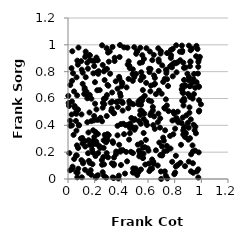
| Category | Series 0 |
|---|---|
| 0.797304120029426 | 0.036 |
| 0.562357184556947 | 0.157 |
| 0.10680305037132208 | 0.306 |
| 0.9210749633324836 | 0.444 |
| 0.9110553314862836 | 0.534 |
| 0.48899094206666055 | 0.079 |
| 0.292231240850581 | 0.625 |
| 0.6947383864375963 | 0.935 |
| 0.542647150077309 | 0.51 |
| 0.5552120279888694 | 0.765 |
| 0.5012308801654148 | 0.446 |
| 0.20232297530727178 | 0.722 |
| 0.7796913870292098 | 0.832 |
| 0.04175667667707427 | 0.329 |
| 0.6522087068755884 | 0.709 |
| 0.18581594822627015 | 0.283 |
| 0.04990359536149041 | 0.544 |
| 0.12496527432047042 | 0.665 |
| 0.8523837978286677 | 0.417 |
| 0.2723379696044072 | 0.557 |
| 0.08138933473945228 | 0.403 |
| 0.915738198230289 | 0.611 |
| 0.18407870867180115 | 0.882 |
| 0.06975780807988681 | 0.013 |
| 0.822844768852436 | 0.104 |
| 0.03783914964844198 | 0.789 |
| 0.2724436079722202 | 0.595 |
| 0.3286869476544123 | 0.117 |
| 0.5074196808023748 | 0.078 |
| 0.3452066169501058 | 0.491 |
| 0.8660786445725674 | 0.548 |
| 0.5507988313020094 | 0.191 |
| 0.2132866893592534 | 0.905 |
| 0.9770257955597358 | 0.072 |
| 0.3736721654983843 | 0.536 |
| 0.15332209954769954 | 0.347 |
| 0.959522285524678 | 0.341 |
| 0.9105750412460314 | 0.494 |
| 0.16311441660137105 | 0.626 |
| 0.6304751476399899 | 0.077 |
| 0.9225078808155771 | 0.057 |
| 0.016827779820845115 | 0.701 |
| 0.872804809920085 | 0.583 |
| 0.03272421377389287 | 0.075 |
| 0.40459552847335645 | 0.72 |
| 0.19645350370171416 | 0.842 |
| 0.93934130254535 | 0.046 |
| 0.631138142138714 | 0.146 |
| 0.44771538818155115 | 0.853 |
| 0.659343890614306 | 0.633 |
| 0.7223621296714514 | 0.206 |
| 0.20224215706489848 | 0.882 |
| 0.12741494213886012 | 0.069 |
| 0.1443889356698664 | 0.867 |
| 0.008023728772806542 | 0.544 |
| 0.22666194082235155 | 0.784 |
| 0.3281425669211869 | 0.524 |
| 0.6809794687354392 | 0.874 |
| 0.9660561663545146 | 0.057 |
| 0.3310503501570942 | 0.645 |
| 0.6848724084109689 | 0.272 |
| 0.8808588103777517 | 0.345 |
| 0.16113645419936 | 0.923 |
| 0.5972478004163653 | 0.229 |
| 0.43587601877007776 | 0.202 |
| 0.6393982162621628 | 0.129 |
| 0.8648941437922311 | 0.867 |
| 0.8032684712133998 | 0.375 |
| 0.9233217938147844 | 0.184 |
| 0.4719972542140556 | 0.203 |
| 0.6365499886286003 | 0.511 |
| 0.30268762180838643 | 0.695 |
| 0.702957025386663 | 0.181 |
| 0.7414386745604448 | 0.247 |
| 0.45045944991184106 | 0.404 |
| 0.15473699106804067 | 0.046 |
| 0.5545125304437247 | 0.507 |
| 0.49676690364538656 | 0.983 |
| 0.02602936098509044 | 0.826 |
| 0.045810744651686996 | 0.653 |
| 0.07406146694787234 | 0.516 |
| 0.918443603866554 | 0.873 |
| 0.10341630874351047 | 0.815 |
| 0.14461916418766874 | 0.601 |
| 0.3427914341111585 | 0.491 |
| 0.22628623821176183 | 0.193 |
| 0.8689484610541626 | 0.38 |
| 0.129187609163948 | 0.91 |
| 0.21180949395285975 | 0.279 |
| 0.8815725052715918 | 0.831 |
| 0.18838875355677628 | 0.197 |
| 0.6190518482586228 | 0.82 |
| 0.74276472355665 | 0.938 |
| 0.9803147501037893 | 0.198 |
| 0.30046426453416303 | 0.942 |
| 0.8394143871771651 | 0.949 |
| 0.519066964696049 | 0.029 |
| 0.5570427996413652 | 0.923 |
| 0.45458405404573626 | 0.746 |
| 0.540816347905991 | 0.478 |
| 0.25542111734223555 | 0.431 |
| 0.532416581095142 | 0.432 |
| 0.1829809473197042 | 0.255 |
| 0.5925604558414671 | 0.402 |
| 0.6224351350225935 | 0.697 |
| 0.3002076240817863 | 0.161 |
| 0.9531077058207814 | 0.212 |
| 0.3714735967905806 | 0.396 |
| 0.2906268035671282 | 0.469 |
| 0.06999816291292076 | 0.882 |
| 0.48494133896559266 | 0.782 |
| 0.4953388224582171 | 0.44 |
| 0.9338875728073217 | 0.25 |
| 0.823182205011867 | 0.502 |
| 0.7858391594595168 | 0.765 |
| 0.3932845069431305 | 0.204 |
| 0.1885405665417277 | 0.363 |
| 0.7354584692676264 | 0.815 |
| 0.060648302424327206 | 0.176 |
| 0.05935084553625411 | 0.433 |
| 0.20801742205660126 | 0.01 |
| 0.9641509602545535 | 0.722 |
| 0.16401753478787567 | 0.922 |
| 0.38127063412288903 | 0.579 |
| 0.8779642598553911 | 0.313 |
| 0.6592409482618403 | 0.214 |
| 0.6510733542427533 | 0.374 |
| 0.9772159047963628 | 0.011 |
| 0.22308847171384444 | 0.885 |
| 0.3352350416149271 | 0.281 |
| 0.33404323952458853 | 0.984 |
| 0.6109073474286287 | 0.797 |
| 0.17469925392602603 | 0.432 |
| 0.9362532482798492 | 0.205 |
| 0.14979038493730507 | 0.823 |
| 0.8704195854369463 | 0.738 |
| 0.3714854138865541 | 0.673 |
| 0.5320488843358153 | 0.211 |
| 0.5285368006332622 | 0.578 |
| 0.5429685772948672 | 0.592 |
| 0.4461229282433632 | 0.979 |
| 0.6057184862246477 | 0.586 |
| 0.49893564743686153 | 0.367 |
| 0.5756301413712744 | 0.237 |
| 0.3194495722353461 | 0.569 |
| 0.42740918105962417 | 0.04 |
| 0.6768639330235154 | 0.974 |
| 0.24380000151550588 | 0.456 |
| 0.12914594599068477 | 0.242 |
| 0.33792508235655505 | 0.269 |
| 0.38596678095672393 | 0.747 |
| 0.253836042151163 | 0.141 |
| 0.13267657503783495 | 0.95 |
| 0.4518898915470631 | 0.528 |
| 0.22114015152068747 | 0.44 |
| 0.7651106759378616 | 0.839 |
| 0.5612880709283763 | 0.663 |
| 0.1611042446127098 | 0.496 |
| 0.6246364032343473 | 0.494 |
| 0.9050246665511441 | 0.382 |
| 0.06249928223592213 | 0.05 |
| 0.937106419909245 | 0.117 |
| 0.383286720690006 | 0.761 |
| 0.7254555668151528 | 0.746 |
| 0.1645117977730222 | 0.885 |
| 0.22456280396033998 | 0.254 |
| 0.4918810724181605 | 0.048 |
| 0.8700690163563919 | 0.599 |
| 0.07869547255718602 | 0.98 |
| 0.9025565244836848 | 0.293 |
| 0.8758902112229859 | 0.69 |
| 0.672815250314741 | 0.101 |
| 0.20485585301376597 | 0.263 |
| 0.03066823520872056 | 0.732 |
| 0.7412310452449627 | 0.548 |
| 0.7340810836164112 | 0.594 |
| 0.22420149753346835 | 0.028 |
| 0.8642706307981797 | 0.362 |
| 0.5727656096740676 | 0.487 |
| 0.4060669496229927 | 0.576 |
| 0.548166236618717 | 0.268 |
| 0.843203091889591 | 0.121 |
| 0.0985648237568677 | 0.878 |
| 0.9148321583627567 | 0.841 |
| 0.8142345100601678 | 0.795 |
| 0.35790775621868903 | 0.728 |
| 0.206093821050002 | 0.171 |
| 0.2703172557518572 | 0.023 |
| 0.7854835093818759 | 0.969 |
| 0.6362372079455503 | 0.537 |
| 0.06598986091912942 | 0.175 |
| 0.293669849148191 | 0.313 |
| 0.41004996959531925 | 0.567 |
| 0.01002077850910882 | 0.193 |
| 0.34955952480190017 | 0.88 |
| 0.46338172848672915 | 0.827 |
| 0.2673401428943209 | 0.288 |
| 0.887785024172174 | 0.475 |
| 0.8953831186326812 | 0.785 |
| 0.9821109829758429 | 0.503 |
| 0.5584376379235363 | 0.602 |
| 0.09608875139694209 | 0.301 |
| 0.7831354166499754 | 0.436 |
| 0.32496604840340954 | 0.508 |
| 0.017226216489252624 | 0.397 |
| 0.10836802645494534 | 0.265 |
| 0.6988554466734901 | 0.001 |
| 0.19770909527727956 | 0.314 |
| 0.85301083655209 | 0.669 |
| 0.5674175522882482 | 0.343 |
| 0.07410152361330873 | 0.852 |
| 0.7227638557844707 | 0.53 |
| 0.48961223081202243 | 0.557 |
| 0.29653284590621415 | 0.701 |
| 0.5675414381891379 | 0.448 |
| 0.8274457523588163 | 0.423 |
| 0.10383125332734139 | 0.013 |
| 0.7338818125610419 | 0.025 |
| 0.2822486413419465 | 0.602 |
| 0.1383652677384979 | 0.651 |
| 0.06845245010346844 | 0.623 |
| 0.46558148122611354 | 0.379 |
| 0.41576375170287677 | 0.412 |
| 0.3784546753050079 | 0.004 |
| 0.8090924068461901 | 0.173 |
| 0.9840513265480847 | 0.51 |
| 0.34517726643714747 | 0.16 |
| 0.603521667022918 | 0.211 |
| 0.781418892971908 | 0.128 |
| 0.27476819642170086 | 0.738 |
| 0.6452212492844311 | 0.772 |
| 0.0022453272982009033 | 0.62 |
| 0.4864344085084499 | 0.049 |
| 0.7658096756290557 | 0.321 |
| 0.5235235113742388 | 0.256 |
| 0.4749817695632405 | 0.455 |
| 0.11010126634993554 | 0.709 |
| 0.06415876302788492 | 0.758 |
| 0.9050520588248738 | 0.737 |
| 0.9324910053666117 | 0.716 |
| 0.2133686257052494 | 0.519 |
| 0.6737084610712148 | 0.424 |
| 0.2615726482339896 | 0.567 |
| 0.5671239560994262 | 0.189 |
| 0.1810660277488201 | 0.22 |
| 0.11215845829499524 | 0.129 |
| 0.4014986894451708 | 0.691 |
| 0.2412715714463095 | 0.231 |
| 0.03439510009841737 | 0.092 |
| 0.1755055344822647 | 0.598 |
| 0.8575446890679195 | 0.694 |
| 0.23985168855966224 | 0.241 |
| 0.6426607134174304 | 0.113 |
| 0.45988779002494656 | 0.844 |
| 0.8799264748782678 | 0.699 |
| 0.26916667587104687 | 0.802 |
| 0.4591966894752576 | 0.58 |
| 0.857182499162693 | 0.956 |
| 0.7734085598031991 | 0.922 |
| 0.5652728024066601 | 0.76 |
| 0.8694342227649041 | 0.828 |
| 0.9825818915672876 | 0.687 |
| 0.6513725492405789 | 0.753 |
| 0.295738558599487 | 0.335 |
| 0.26020869760470455 | 0.531 |
| 0.5796788552624791 | 0.108 |
| 0.4582153987161802 | 0.294 |
| 0.38142065952664705 | 0.025 |
| 0.5200496166068674 | 0.952 |
| 0.8477210650049647 | 0.255 |
| 0.5882600367158707 | 0.975 |
| 0.6971103597099408 | 0.056 |
| 0.407214119637355 | 0.711 |
| 0.8039897851006478 | 0.048 |
| 0.9807452674552787 | 0.89 |
| 0.38379778552751426 | 0.255 |
| 0.5614805224067287 | 0.156 |
| 0.8836726423037224 | 0.339 |
| 0.9447524073055915 | 0.633 |
| 0.8644978518637901 | 0.331 |
| 0.07576121161950675 | 0.231 |
| 0.2603331779744485 | 0.85 |
| 0.7538686459995365 | 0.506 |
| 0.8094906222755434 | 0.862 |
| 0.43330961252376127 | 0.401 |
| 0.4431646850943232 | 0.132 |
| 0.39472319933808764 | 0.618 |
| 0.618096083391179 | 0.476 |
| 0.2602046042790533 | 0.051 |
| 0.2895184351533712 | 0.975 |
| 0.07310537785946165 | 0.519 |
| 0.05828456534873092 | 0.493 |
| 0.9068467683924778 | 0.761 |
| 0.3956129694781057 | 0.214 |
| 0.0516951853102892 | 0.531 |
| 0.5756874430026223 | 0.62 |
| 0.6180661632846933 | 0.653 |
| 0.004809480179992467 | 0.566 |
| 0.9825613853273992 | 0.587 |
| 0.15684512268392706 | 0.135 |
| 0.5446679513971208 | 0.737 |
| 0.790492964055465 | 0.501 |
| 0.3054453251772024 | 0.327 |
| 0.5554888625045465 | 0.87 |
| 0.02686627554059232 | 0.48 |
| 0.7066479047382231 | 0.175 |
| 0.9151003660005707 | 0.304 |
| 0.9457435785732388 | 0.783 |
| 0.90095803491139 | 0.634 |
| 0.9067710662359609 | 0.994 |
| 0.528862186058034 | 0.052 |
| 0.3626815460336315 | 0.574 |
| 0.5866720743469122 | 0.425 |
| 0.39657103228836854 | 0.409 |
| 0.014730724771870797 | 0.434 |
| 0.029920722607236227 | 0.578 |
| 0.48696318953746487 | 0.193 |
| 0.7284497106145716 | 0.363 |
| 0.9199815790702903 | 0.96 |
| 0.30613459372560664 | 0.874 |
| 0.0669780876922208 | 0.251 |
| 0.7263412560391058 | 0.057 |
| 0.6076121965987406 | 0.822 |
| 0.06201714419842743 | 0.486 |
| 0.10064061084578058 | 0.14 |
| 0.7050010169363431 | 0.243 |
| 0.0766252179057523 | 0.077 |
| 0.8592773684940184 | 0.645 |
| 0.6247312873540295 | 0.579 |
| 0.6822901701502448 | 0.659 |
| 0.8257055690172047 | 0.434 |
| 0.9633764689223475 | 0.992 |
| 0.13705828105226775 | 0.928 |
| 0.14477100718266808 | 0.423 |
| 0.28579359313208597 | 0.011 |
| 0.3130297786562835 | 0.951 |
| 0.6899467826698211 | 0.383 |
| 0.9539044764418823 | 0.68 |
| 0.9297175533848173 | 0.972 |
| 0.397381141640462 | 0.104 |
| 0.619306198417967 | 0.075 |
| 0.2651237000391106 | 0.164 |
| 0.06331651306339428 | 0.361 |
| 0.7964426893282355 | 0.487 |
| 0.22978981004316248 | 0.804 |
| 0.743442544627824 | 0.744 |
| 0.8760143716886184 | 0.39 |
| 0.46234573667447093 | 0.563 |
| 0.8562790481345838 | 0.947 |
| 0.19042172374567648 | 0.787 |
| 0.12475027504628891 | 0.679 |
| 0.35951321038766704 | 0.185 |
| 0.42068747166704823 | 0.981 |
| 0.27546209463214005 | 0.328 |
| 0.5494695950315683 | 0.795 |
| 0.48581099935149097 | 0.731 |
| 0.21625445125874593 | 0.794 |
| 0.7139729454529784 | 0.724 |
| 0.3432241163834253 | 0.008 |
| 0.19382821100100156 | 0.437 |
| 0.4552235073574578 | 0.877 |
| 0.9784545831754908 | 0.691 |
| 0.6464367453308284 | 0.704 |
| 0.032435237734660075 | 0.952 |
| 0.677905402750759 | 0.487 |
| 0.8567298283045552 | 0.583 |
| 0.16998374227502902 | 0.065 |
| 0.6102185368032516 | 0.059 |
| 0.3504658569854561 | 0.904 |
| 0.49676613900140887 | 0.759 |
| 0.6798972998590397 | 0.805 |
| 0.9968988769972482 | 0.557 |
| 0.3870013244021764 | 0.909 |
| 0.29712299850714974 | 0.289 |
| 0.7260661426685774 | 0.525 |
| 0.15042039426362816 | 0.192 |
| 0.5384596136964156 | 0.188 |
| 0.9747916835115862 | 0.786 |
| 0.7689942963353654 | 0.227 |
| 0.3347029078208359 | 0.012 |
| 0.917203889078772 | 0.693 |
| 0.467721457080699 | 0.414 |
| 0.27035746845487907 | 0.109 |
| 0.7424563624404802 | 0.211 |
| 0.2553658385855573 | 0.996 |
| 0.5695583119963499 | 0.895 |
| 0.771076913698367 | 0.903 |
| 0.21910179362404075 | 0.661 |
| 0.9057513528263446 | 0.13 |
| 0.9767790280379692 | 0.836 |
| 0.7743268950842448 | 0.845 |
| 0.22387142021862252 | 0.335 |
| 0.23767545307786073 | 0.663 |
| 0.9348922897027911 | 0.599 |
| 0.6460622941644426 | 0.466 |
| 0.5842662489798098 | 0.292 |
| 0.6919693569353385 | 0.452 |
| 0.10116966542848344 | 0.481 |
| 0.21262757020652331 | 0.02 |
| 0.48633450989087246 | 0.817 |
| 0.7190362819838224 | 0.285 |
| 0.9421776042672716 | 0.404 |
| 0.31595131355604333 | 0.784 |
| 0.9775082314541079 | 0.873 |
| 0.48414181989500454 | 0.385 |
| 0.5479995844867132 | 0.553 |
| 0.5115442619289495 | 0.933 |
| 0.7024560405918445 | 0.636 |
| 0.5097805970019827 | 0.783 |
| 0.7450069630964918 | 0.004 |
| 0.16248669432945304 | 0.121 |
| 0.7503567605256987 | 0.693 |
| 0.2830791694619875 | 0.297 |
| 0.28519696175470305 | 0.274 |
| 0.5385193362197296 | 0.865 |
| 0.8113984964656171 | 0.996 |
| 0.41071914085660216 | 0.215 |
| 0.6141924025199114 | 0.95 |
| 0.9116224893443969 | 0.691 |
| 0.8991625504133357 | 0.418 |
| 0.8057019267391398 | 0.443 |
| 0.015661915755941974 | 0.065 |
| 0.6385026655596802 | 0.123 |
| 0.5272431736075213 | 0.557 |
| 0.34421798561215405 | 0.112 |
| 0.18362760949765966 | 0.11 |
| 0.15313383570546582 | 0.621 |
| 0.5598913405731432 | 0.232 |
| 0.8609393445567936 | 0.458 |
| 0.8137282137763063 | 0.454 |
| 0.6070206935943088 | 0.115 |
| 0.20607146033773108 | 0.351 |
| 0.8414749345524128 | 0.885 |
| 0.29025393959805806 | 0.193 |
| 0.7380280325528474 | 0.807 |
| 0.37149336084959533 | 0.326 |
| 0.7974506682067312 | 0.866 |
| 0.29241995835013396 | 0.82 |
| 0.34265281128710257 | 0.102 |
| 0.39011024347265294 | 0.998 |
| 0.8777436865434023 | 0.096 |
| 0.7898541810798125 | 0.333 |
| 0.7722232461864666 | 0.962 |
| 0.5425761005861899 | 0.978 |
| 0.04627374476935412 | 0.149 |
| 0.7063876377240527 | 0.847 |
| 0.8541766694042916 | 0.994 |
| 0.2552027712553556 | 0.106 |
| 0.27959808542192954 | 0.817 |
| 0.08259889034940095 | 0.399 |
| 0.19608152867063164 | 0.469 |
| 0.5345278511078847 | 0.169 |
| 0.0718846000526459 | 0.048 |
| 0.5470415237319559 | 0.071 |
| 0.9411754766869815 | 0.745 |
| 0.36135053411920337 | 0.205 |
| 0.8222868577643778 | 0.87 |
| 0.5066670601417708 | 0.383 |
| 0.4744401138850245 | 0.562 |
| 0.7376615250901122 | 0.789 |
| 0.9182837378891604 | 0.876 |
| 0.12162286062001304 | 0.633 |
| 0.13298646174309464 | 0.759 |
| 0.267556850640766 | 0.232 |
| 0.11275891338012904 | 0.117 |
| 0.3311985178689576 | 0.577 |
| 0.9711901253785186 | 0.969 |
| 0.6388332280423312 | 0.402 |
| 0.6794441233843596 | 0.891 |
| 0.16301379789801654 | 0.254 |
| 0.15449477338634737 | 0.289 |
| 0.46409077112375724 | 0.341 |
| 0.5462041460638986 | 0.412 |
| 0.9889556700665192 | 0.91 |
| 0.6919381977309248 | 0.177 |
| 0.7139344430014956 | 0.308 |
| 0.11043020945263346 | 0.792 |
| 0.6321346026048353 | 0.886 |
| 0.40993756799125786 | 0.51 |
| 0.8086763517272694 | 0.093 |
| 0.1745721798283946 | 0.031 |
| 0.2029678548489935 | 0.561 |
| 0.5173963668490128 | 0.95 |
| 0.11870409010896339 | 0.281 |
| 0.696318610579544 | 0.953 |
| 0.6432320884267461 | 0.925 |
| 0.783442085726307 | 0.854 |
| 0.5861662409248689 | 0.716 |
| 0.39018518610185277 | 0.638 |
| 0.5562254789042881 | 0.585 |
| 0.8565719197163875 | 0.665 |
| 0.43923968506000294 | 0.683 |
| 0.8634291659700921 | 0.641 |
| 0.1269591536728831 | 0.283 |
| 0.2707932325231331 | 0.599 |
| 0.9553391238210023 | 0.389 |
| 0.4205014791503321 | 0.334 |
| 0.9494315298170858 | 0.363 |
| 0.9606594686665789 | 0.915 |
| 0.029016260346457073 | 0.399 |